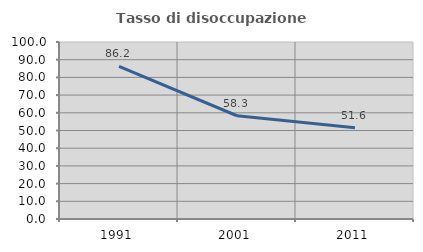
| Category | Tasso di disoccupazione giovanile  |
|---|---|
| 1991.0 | 86.218 |
| 2001.0 | 58.333 |
| 2011.0 | 51.562 |